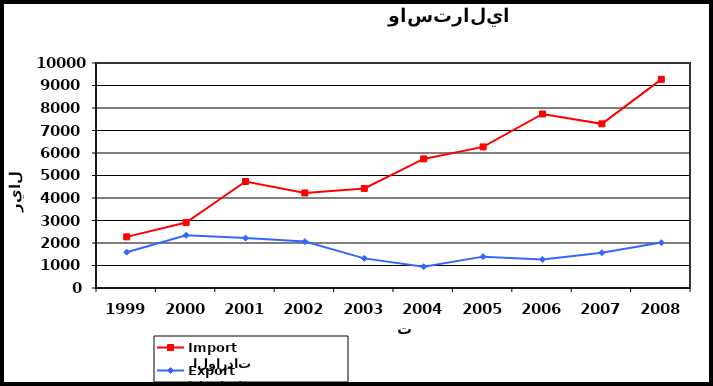
| Category |  الواردات           Import | الصادرات          Export |
|---|---|---|
| 1999.0 | 2273 | 1591 |
| 2000.0 | 2907 | 2344 |
| 2001.0 | 4733 | 2218 |
| 2002.0 | 4223 | 2062 |
| 2003.0 | 4425 | 1317 |
| 2004.0 | 5737 | 946 |
| 2005.0 | 6270 | 1394 |
| 2006.0 | 7734 | 1269 |
| 2007.0 | 7296 | 1565 |
| 2008.0 | 9274 | 2018 |